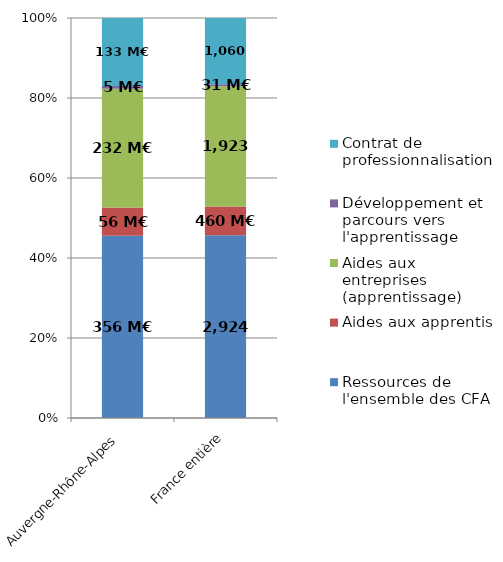
| Category | Ressources de l'ensemble des CFA | Aides aux apprentis | Aides aux entreprises (apprentissage) | Développement et parcours vers l'apprentissage | Contrat de professionnalisation |
|---|---|---|---|---|---|
| Auvergne-Rhône-Alpes | 356.381 | 55.539 | 232.473 | 5.1 | 133.178 |
| France entière | 2924.219 | 459.796 | 1923.184 | 31.421 | 1060.48 |